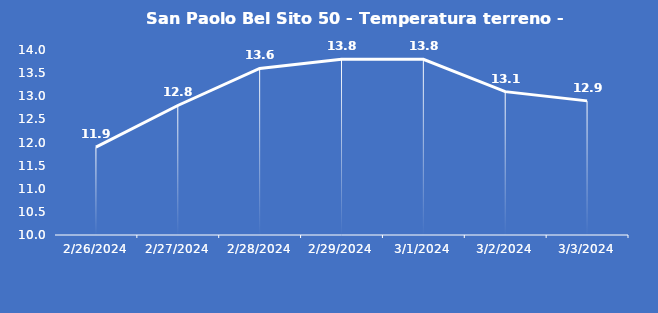
| Category | San Paolo Bel Sito 50 - Temperatura terreno - Grezzo (°C) |
|---|---|
| 2/26/24 | 11.9 |
| 2/27/24 | 12.8 |
| 2/28/24 | 13.6 |
| 2/29/24 | 13.8 |
| 3/1/24 | 13.8 |
| 3/2/24 | 13.1 |
| 3/3/24 | 12.9 |